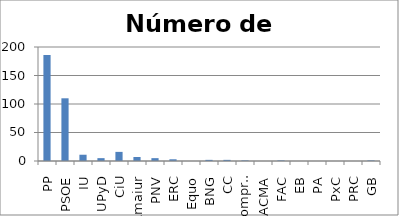
| Category | Escaños |
|---|---|
| PP | 186 |
| PSOE | 110 |
| IU | 11 |
| UPyD | 5 |
| CiU | 16 |
| Amaiur | 7 |
| PNV | 5 |
| ERC | 3 |
| Equo | 0 |
| BNG | 2 |
| CC | 2 |
| Compromís | 1 |
| PACMA | 0 |
| FAC | 1 |
| EB | 0 |
| PA | 0 |
| PxC | 0 |
| PRC | 0 |
| GB | 1 |